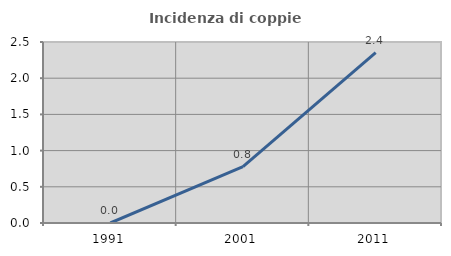
| Category | Incidenza di coppie miste |
|---|---|
| 1991.0 | 0 |
| 2001.0 | 0.777 |
| 2011.0 | 2.353 |